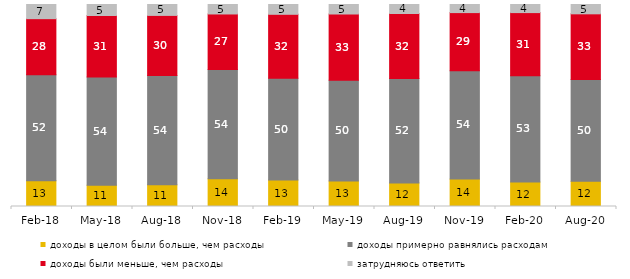
| Category | доходы в целом были больше, чем расходы | доходы примерно равнялись расходам | доходы были меньше, чем расходы | затрудняюсь ответить |
|---|---|---|---|---|
| 2018-02-01 | 12.75 | 52.3 | 27.75 | 7 |
| 2018-05-01 | 10.55 | 53.5 | 30.5 | 5.45 |
| 2018-08-01 | 10.75 | 54.05 | 29.8 | 5.4 |
| 2018-11-01 | 13.723 | 54.092 | 27.495 | 4.691 |
| 2019-02-01 | 13.1 | 50.4 | 31.65 | 4.85 |
| 2019-05-01 | 12.63 | 49.926 | 32.739 | 4.705 |
| 2019-08-01 | 11.688 | 51.648 | 32.218 | 4.446 |
| 2019-11-01 | 13.564 | 53.614 | 28.812 | 4.01 |
| 2020-02-01 | 12.079 | 52.673 | 31.238 | 4.01 |
| 2020-08-01 | 12.463 | 50.397 | 32.522 | 4.618 |